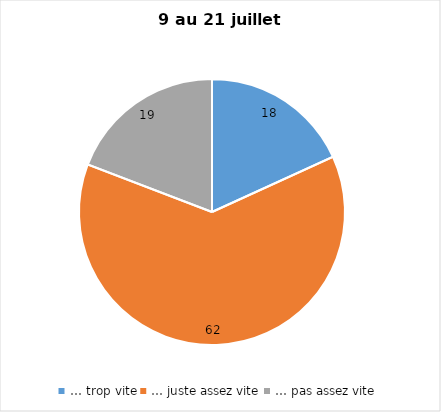
| Category | Series 0 |
|---|---|
| … trop vite | 18 |
| … juste assez vite | 62 |
| … pas assez vite | 19 |